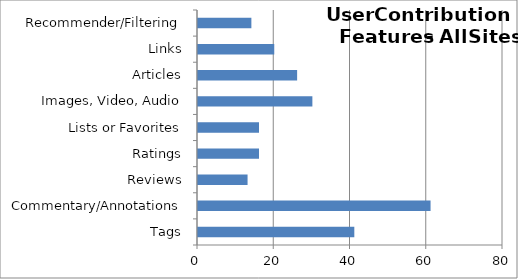
| Category | Series 0 |
|---|---|
| Tags | 41 |
| Commentary/Annotations | 61 |
| Reviews | 13 |
| Ratings | 16 |
| Lists or Favorites | 16 |
| Images, Video, Audio | 30 |
| Articles | 26 |
| Links | 20 |
| Recommender/Filtering | 14 |